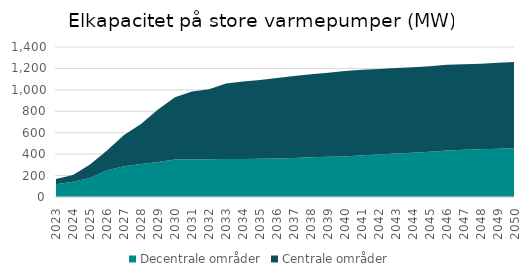
| Category | Decentrale områder | Centrale områder |
|---|---|---|
| 2023.0 | 120.13 | 46.75 |
| 2024.0 | 143.14 | 61.53 |
| 2025.0 | 178.05 | 126.44 |
| 2026.0 | 250.65 | 182.73 |
| 2027.0 | 287.8 | 290.7 |
| 2028.0 | 308.99 | 372.22 |
| 2029.0 | 326.68 | 489.11 |
| 2030.0 | 350.32 | 579.72 |
| 2031.0 | 353.12 | 631.46 |
| 2032.0 | 353.41 | 652.94 |
| 2033.0 | 354.73 | 704.26 |
| 2034.0 | 354.73 | 724.43 |
| 2035.0 | 356.05 | 734.8 |
| 2036.0 | 360.48 | 750.87 |
| 2037.0 | 364.53 | 765.49 |
| 2038.0 | 371.79 | 774.11 |
| 2039.0 | 376.18 | 782.73 |
| 2040.0 | 379.09 | 797.35 |
| 2041.0 | 388.82 | 798.7 |
| 2042.0 | 396 | 798.72 |
| 2043.0 | 405.62 | 798.75 |
| 2044.0 | 412.77 | 798.77 |
| 2045.0 | 421.22 | 798.8 |
| 2046.0 | 435.12 | 798.8 |
| 2047.0 | 440.94 | 798.8 |
| 2048.0 | 445.58 | 798.8 |
| 2049.0 | 449.91 | 803.77 |
| 2050.0 | 455.87 | 803.77 |